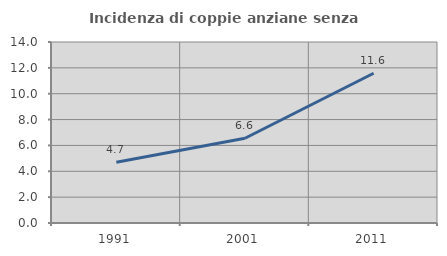
| Category | Incidenza di coppie anziane senza figli  |
|---|---|
| 1991.0 | 4.704 |
| 2001.0 | 6.553 |
| 2011.0 | 11.585 |